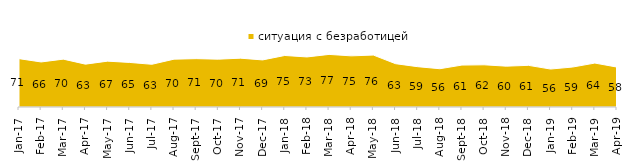
| Category | ситуация с безработицей |
|---|---|
| 2017-01-01 | 70.75 |
| 2017-02-01 | 65.9 |
| 2017-03-01 | 70.05 |
| 2017-04-01 | 62.7 |
| 2017-05-01 | 67.1 |
| 2017-06-01 | 65.2 |
| 2017-07-01 | 62.5 |
| 2017-08-01 | 70 |
| 2017-09-01 | 70.75 |
| 2017-10-01 | 70 |
| 2017-11-01 | 71.45 |
| 2017-12-01 | 68.9 |
| 2018-01-01 | 75.4 |
| 2018-02-01 | 73.25 |
| 2018-03-01 | 76.95 |
| 2018-04-01 | 74.85 |
| 2018-05-01 | 76 |
| 2018-06-01 | 63.4 |
| 2018-07-01 | 59 |
| 2018-08-01 | 56 |
| 2018-09-01 | 61.35 |
| 2018-10-01 | 61.75 |
| 2018-11-01 | 59.78 |
| 2018-12-01 | 60.95 |
| 2019-01-01 | 55.55 |
| 2019-02-01 | 58.5 |
| 2019-03-01 | 64.296 |
| 2019-04-01 | 58.416 |